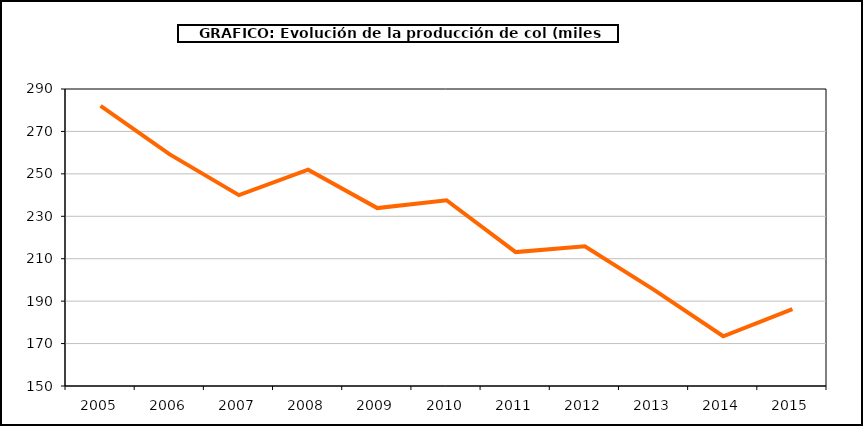
| Category | producción |
|---|---|
| 2005.0 | 282.003 |
| 2006.0 | 259.159 |
| 2007.0 | 239.973 |
| 2008.0 | 251.99 |
| 2009.0 | 233.866 |
| 2010.0 | 237.56 |
| 2011.0 | 213.127 |
| 2012.0 | 215.885 |
| 2013.0 | 195.301 |
| 2014.0 | 173.454 |
| 2015.0 | 186.202 |